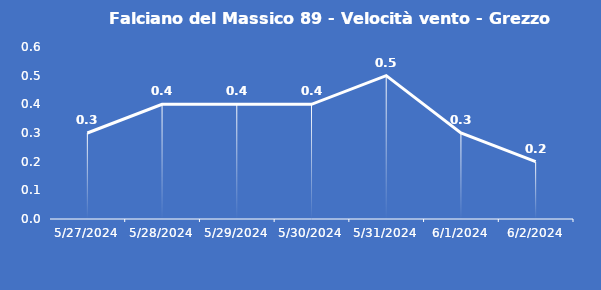
| Category | Falciano del Massico 89 - Velocità vento - Grezzo (m/s) |
|---|---|
| 5/27/24 | 0.3 |
| 5/28/24 | 0.4 |
| 5/29/24 | 0.4 |
| 5/30/24 | 0.4 |
| 5/31/24 | 0.5 |
| 6/1/24 | 0.3 |
| 6/2/24 | 0.2 |